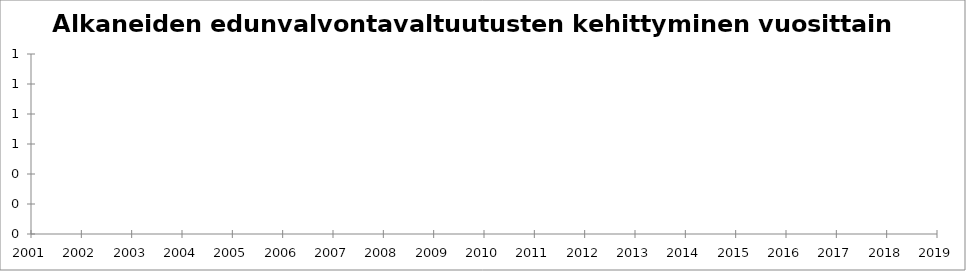
| Category | Series 0 |
|---|---|
| 2001 | 1 |
| 2002 | 0 |
| 2003 | 0 |
| 2004 | 0 |
| 2005 | 0 |
| 2006 | 0 |
| 2007 | 1 |
| 2008 | 70 |
| 2009 | 162 |
| 2010 | 271 |
| 2011 | 435 |
| 2012 | 585 |
| 2013 | 858 |
| 2014 | 1162 |
| 2015 | 1471 |
| 2016 | 2169 |
| 2017 | 2833 |
| 2018 | 3508 |
| 2019 | 4459 |